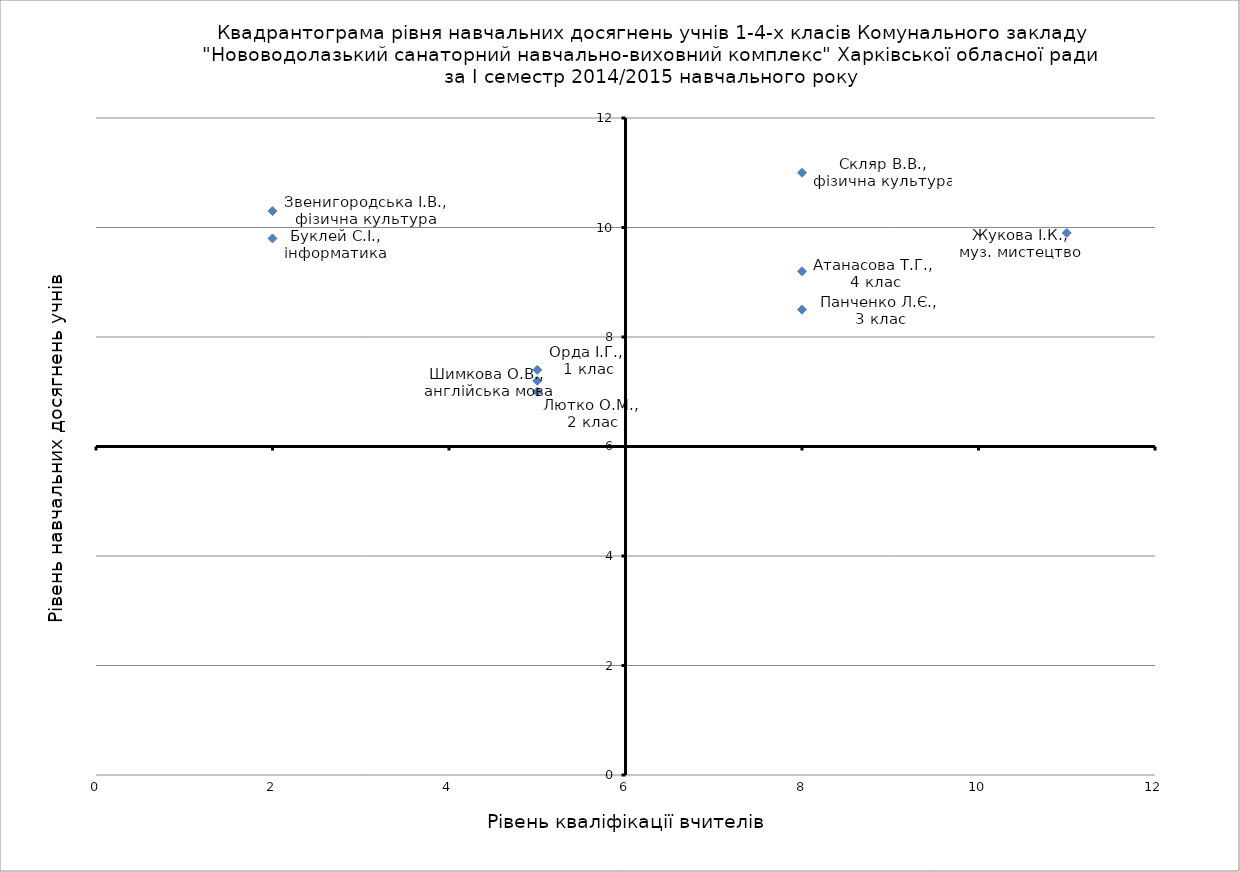
| Category | Рівень навчальних досягнень учнів |
|---|---|
| 5.0 | 7.4 |
| 5.0 | 7 |
| 8.0 | 8.5 |
| 8.0 | 9.2 |
| 5.0 | 7.2 |
| 2.0 | 10.3 |
| 8.0 | 11 |
| 11.0 | 9.9 |
| 2.0 | 9.8 |